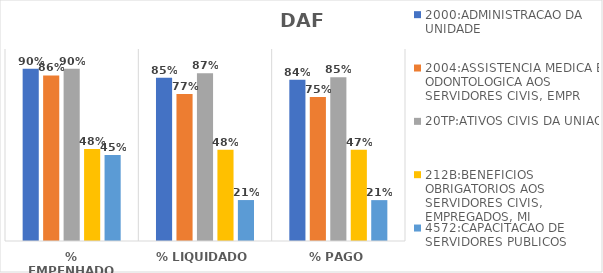
| Category | 2000:ADMINISTRACAO DA UNIDADE | 2004:ASSISTENCIA MEDICA E ODONTOLOGICA AOS SERVIDORES CIVIS, EMPR | 20TP:ATIVOS CIVIS DA UNIAO | 212B:BENEFICIOS OBRIGATORIOS AOS SERVIDORES CIVIS, EMPREGADOS, MI | 4572:CAPACITACAO DE SERVIDORES PUBLICOS FEDERAIS EM PROCESSO DE Q |
|---|---|---|---|---|---|
| % EMPENHADO | 0.897 | 0.862 | 0.898 | 0.48 | 0.448 |
| % LIQUIDADO | 0.85 | 0.766 | 0.873 | 0.475 | 0.213 |
| % PAGO | 0.84 | 0.75 | 0.853 | 0.475 | 0.213 |